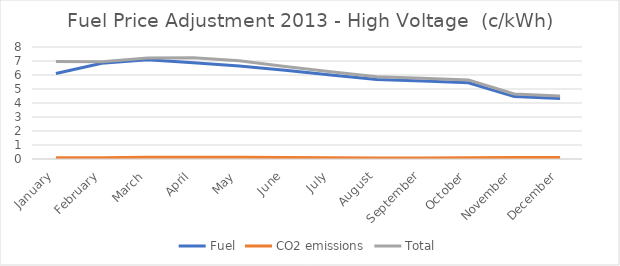
| Category | Fuel | CO2 emissions | Total |
|---|---|---|---|
| January | 6.108 | 0.093 | 6.972 |
| February | 6.834 | 0.098 | 6.94 |
| March | 7.081 | 0.12 | 7.208 |
| April | 6.873 | 0.12 | 7.234 |
| May | 6.645 | 0.124 | 7.019 |
| June | 6.344 | 0.104 | 6.6 |
| July | 6 | 0.094 | 6.233 |
| August | 5.672 | 0.075 | 5.873 |
| September | 5.566 | 0.074 | 5.763 |
| October | 5.441 | 0.092 | 5.649 |
| November | 4.459 | 0.104 | 4.64 |
| December | 4.32 | 0.112 | 4.503 |